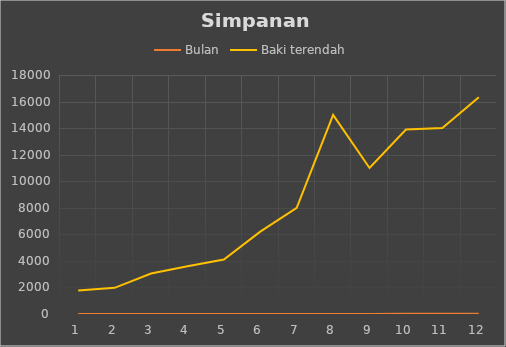
| Category | Bulan | Baki terendah |
|---|---|---|
| 0 | 1 | 1765 |
| 1 | 2 | 1970 |
| 2 | 3 | 3050.58 |
| 3 | 4 | 3590.58 |
| 4 | 5 | 4100.58 |
| 5 | 6 | 6200 |
| 6 | 7 | 8000 |
| 7 | 8 | 15000 |
| 8 | 9 | 11000 |
| 9 | 10 | 13900 |
| 10 | 11 | 14000 |
| 11 | 12 | 16320 |